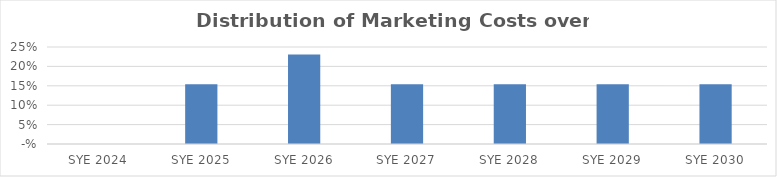
| Category | Series 0 |
|---|---|
| 2024.0 | 0 |
| 2025.0 | 0.154 |
| 2026.0 | 0.231 |
| 2027.0 | 0.154 |
| 2028.0 | 0.154 |
| 2029.0 | 0.154 |
| 2030.0 | 0.154 |